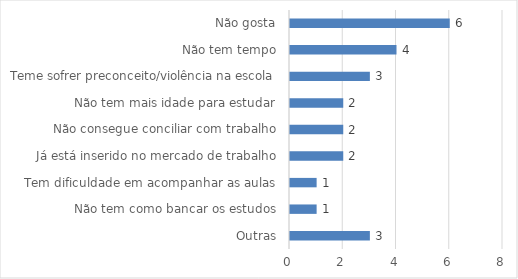
| Category | Series 0 |
|---|---|
| Outras | 3 |
| Não tem como bancar os estudos | 1 |
| Tem dificuldade em acompanhar as aulas | 1 |
| Já está inserido no mercado de trabalho | 2 |
| Não consegue conciliar com trabalho | 2 |
| Não tem mais idade para estudar | 2 |
| Teme sofrer preconceito/violência na escola | 3 |
| Não tem tempo | 4 |
| Não gosta | 6 |